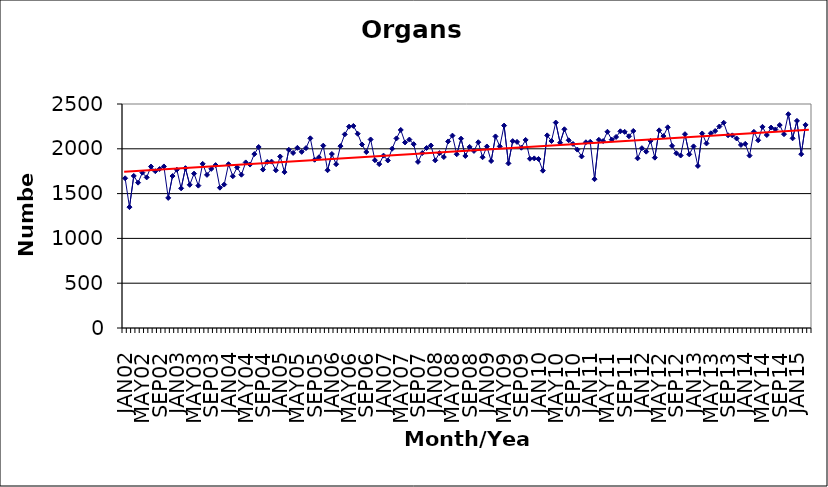
| Category | Series 0 |
|---|---|
| JAN02 | 1671 |
| FEB02 | 1349 |
| MAR02 | 1697 |
| APR02 | 1622 |
| MAY02 | 1734 |
| JUN02 | 1681 |
| JUL02 | 1802 |
| AUG02 | 1750 |
| SEP02 | 1774 |
| OCT02 | 1803 |
| NOV02 | 1452 |
| DEC02 | 1696 |
| JAN03 | 1767 |
| FEB03 | 1559 |
| MAR03 | 1784 |
| APR03 | 1598 |
| MAY03 | 1723 |
| JUN03 | 1589 |
| JUL03 | 1832 |
| AUG03 | 1709 |
| SEP03 | 1776 |
| OCT03 | 1818 |
| NOV03 | 1566 |
| DEC03 | 1601 |
| JAN04 | 1828 |
| FEB04 | 1694 |
| MAR04 | 1793 |
| APR04 | 1711 |
| MAY04 | 1848 |
| JUN04 | 1824 |
| JUL04 | 1941 |
| AUG04 | 2020 |
| SEP04 | 1768 |
| OCT04 | 1853 |
| NOV04 | 1857 |
| DEC04 | 1760 |
| JAN05 | 1914 |
| FEB05 | 1740 |
| MAR05 | 1989 |
| APR05 | 1954 |
| MAY05 | 2011 |
| JUN05 | 1966 |
| JUL05 | 2008 |
| AUG05 | 2117 |
| SEP05 | 1878 |
| OCT05 | 1905 |
| NOV05 | 2035 |
| DEC05 | 1761 |
| JAN06 | 1942 |
| FEB06 | 1828 |
| MAR06 | 2030 |
| APR06 | 2161 |
| MAY06 | 2247 |
| JUN06 | 2255 |
| JUL06 | 2168 |
| AUG06 | 2048 |
| SEP06 | 1964 |
| OCT06 | 2104 |
| NOV06 | 1873 |
| DEC06 | 1829 |
| JAN07 | 1924 |
| FEB07 | 1870 |
| MAR07 | 2001 |
| APR07 | 2116 |
| MAY07 | 2210 |
| JUN07 | 2071 |
| JUL07 | 2103 |
| AUG07 | 2052 |
| SEP07 | 1854 |
| OCT07 | 1953 |
| NOV07 | 2009 |
| DEC07 | 2037 |
| JAN08 | 1871 |
| FEB08 | 1952 |
| MAR08 | 1908 |
| APR08 | 2082 |
| MAY08 | 2147 |
| JUN08 | 1939 |
| JUL08 | 2113 |
| AUG08 | 1920 |
| SEP08 | 2021 |
| OCT08 | 1976 |
| NOV08 | 2073 |
| DEC08 | 1906 |
| JAN09 | 2026 |
| FEB09 | 1864 |
| MAR09 | 2138 |
| APR09 | 2027 |
| MAY09 | 2259 |
| JUN09 | 1837 |
| JUL09 | 2086 |
| AUG09 | 2077 |
| SEP09 | 2012 |
| OCT09 | 2099 |
| NOV09 | 1889 |
| DEC09 | 1893 |
| JAN10 | 1886 |
| FEB10 | 1756 |
| MAR10 | 2150 |
| APR10 | 2087 |
| MAY10 | 2293 |
| JUN10 | 2068 |
| JUL10 | 2218 |
| AUG10 | 2095 |
| SEP10 | 2054 |
| OCT10 | 1991 |
| NOV10 | 1915 |
| DEC10 | 2073 |
| JAN11 | 2078 |
| FEB11 | 1661 |
| MAR11 | 2100 |
| APR11 | 2086 |
| MAY11 | 2190 |
| JUN11 | 2102 |
| JUL11 | 2132 |
| AUG11 | 2195 |
| SEP11 | 2189 |
| OCT11 | 2140 |
| NOV11 | 2199 |
| DEC11 | 1894 |
| JAN12 | 2007 |
| FEB12 | 1968 |
| MAR12 | 2088 |
| APR12 | 1901 |
| MAY12 | 2206 |
| JUN12 | 2142 |
| JUL12 | 2240 |
| AUG12 | 2033 |
| SEP12 | 1950 |
| OCT12 | 1925 |
| NOV12 | 2163 |
| DEC12 | 1938 |
| JAN13 | 2027 |
| FEB13 | 1809 |
| MAR13 | 2171 |
| APR13 | 2060 |
| MAY13 | 2173 |
| JUN13 | 2198 |
| JUL13 | 2249 |
| AUG13 | 2291 |
| SEP13 | 2151 |
| OCT13 | 2150 |
| NOV13 | 2115 |
| DEC13 | 2043 |
| JAN14 | 2055 |
| FEB14 | 1924 |
| MAR14 | 2189 |
| APR14 | 2095 |
| MAY14 | 2245 |
| JUN14 | 2154 |
| JUL14 | 2237 |
| AUG14 | 2216 |
| SEP14 | 2265 |
| OCT14 | 2163 |
| NOV14 | 2386 |
| DEC14 | 2117 |
| JAN15 | 2312 |
| FEB15 | 1940 |
| MAR15 | 2267 |